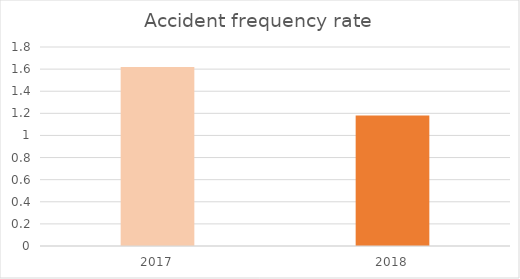
| Category | Series 0 |
|---|---|
| 0 | 1.62 |
| 1 | 1.18 |